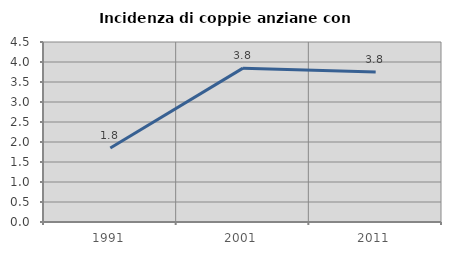
| Category | Incidenza di coppie anziane con figli |
|---|---|
| 1991.0 | 1.849 |
| 2001.0 | 3.846 |
| 2011.0 | 3.75 |